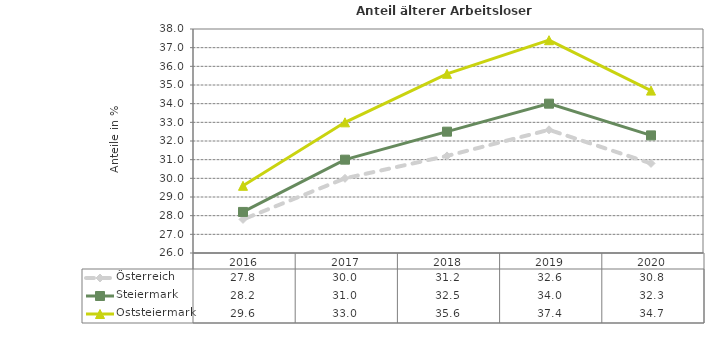
| Category | Österreich | Steiermark | Oststeiermark |
|---|---|---|---|
| 2020.0 | 30.8 | 32.3 | 34.7 |
| 2019.0 | 32.6 | 34 | 37.4 |
| 2018.0 | 31.2 | 32.5 | 35.6 |
| 2017.0 | 30 | 31 | 33 |
| 2016.0 | 27.8 | 28.2 | 29.6 |